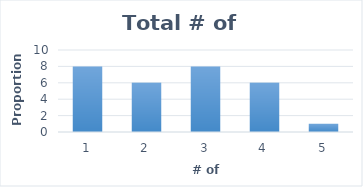
| Category | # |
|---|---|
| 1.0 | 8 |
| 2.0 | 6 |
| 3.0 | 8 |
| 4.0 | 6 |
| 5.0 | 1 |